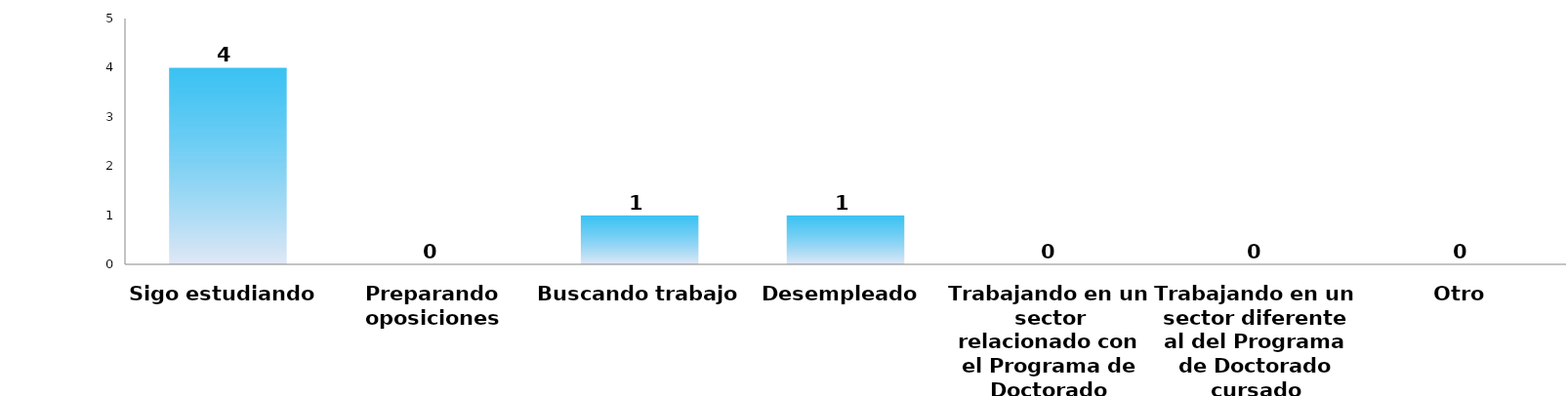
| Category | Series 0 |
|---|---|
| Sigo estudiando | 4 |
| Preparando oposiciones | 0 |
| Buscando trabajo | 1 |
| Desempleado | 1 |
| Trabajando en un sector relacionado con el Programa de Doctorado cursado | 0 |
| Trabajando en un sector diferente al del Programa de Doctorado cursado | 0 |
| Otro | 0 |